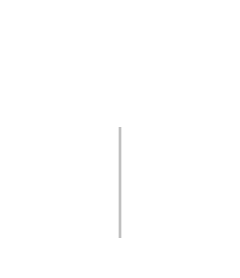
| Category | Positiivinen | Negatiivinen |
|---|---|---|
| 0 | 0 | 0 |
| 1 | 428736 | 0 |
| 2 | 428736 | -428736 |